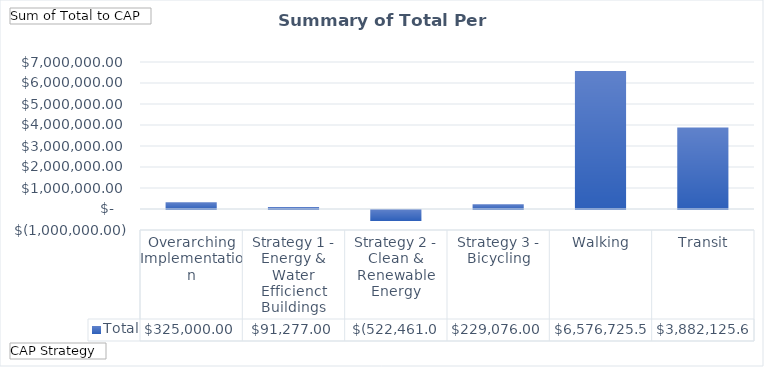
| Category | Total |
|---|---|
| Overarching Implementation | 325000 |
| Strategy 1 - Energy & Water Efficienct Buildings | 91277 |
| Strategy 2 - Clean & Renewable Energy | -522461 |
| Strategy 3 - Bicycling, Walking, Transit, and Land Use  | 229076 |
| Strategy 4 - Zero Waste | 6576725.5 |
| Strategy 5  - Resiliency | 3882125.6 |